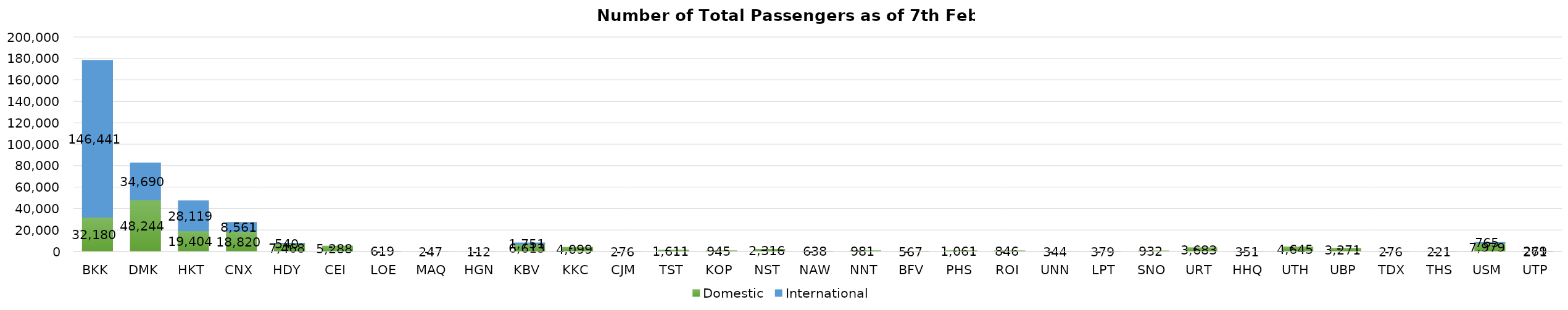
| Category | Domestic | International |
|---|---|---|
| BKK | 32180 | 146441 |
| DMK | 48244 | 34690 |
| HKT | 19404 | 28119 |
| CNX | 18820 | 8561 |
| HDY | 7468 | 540 |
| CEI | 5288 | 0 |
| LOE | 619 | 0 |
| MAQ | 247 | 0 |
| HGN | 112 | 0 |
| KBV | 6613 | 1751 |
| KKC | 4099 | 0 |
| CJM | 276 | 0 |
| TST | 1611 | 0 |
| KOP | 945 | 0 |
| NST | 2316 | 0 |
| NAW | 638 | 0 |
| NNT | 981 | 0 |
| BFV | 567 | 0 |
| PHS | 1061 | 0 |
| ROI | 846 | 0 |
| UNN | 344 | 0 |
| LPT | 379 | 0 |
| SNO | 932 | 0 |
| URT | 3683 | 0 |
| HHQ | 351 | 0 |
| UTH | 4645 | 0 |
| UBP | 3271 | 0 |
| TDX | 276 | 0 |
| THS | 221 | 0 |
| USM | 7979 | 765 |
| UTP | 271 | 269 |